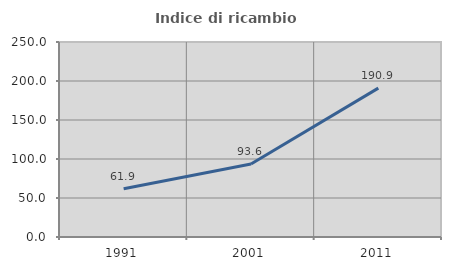
| Category | Indice di ricambio occupazionale  |
|---|---|
| 1991.0 | 61.914 |
| 2001.0 | 93.593 |
| 2011.0 | 190.859 |